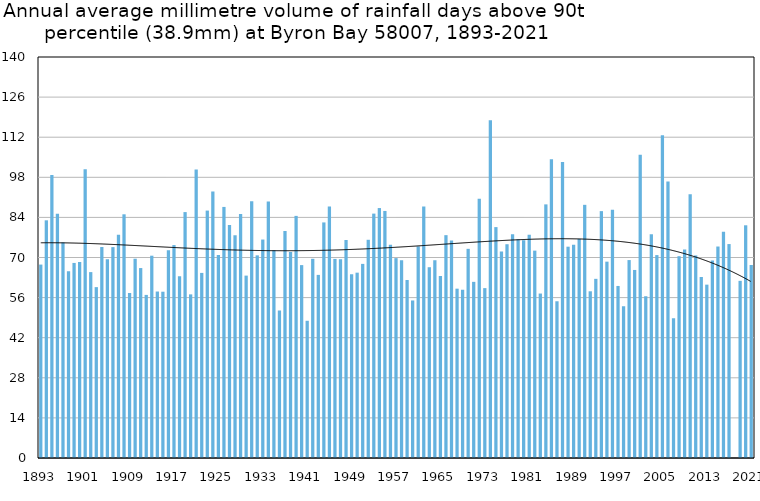
| Category | Annual average mm in days above 90th percentile |
|---|---|
| 1893 | 67.529 |
| 1894 | 82.979 |
| 1895 | 98.811 |
| 1896 | 85.3 |
| 1897 | 75.275 |
| 1898 | 65.223 |
| 1899 | 68.1 |
| 1900 | 68.4 |
| 1901 | 100.85 |
| 1902 | 64.9 |
| 1903 | 59.657 |
| 1904 | 73.658 |
| 1905 | 69.382 |
| 1906 | 73.627 |
| 1907 | 77.9 |
| 1908 | 85.082 |
| 1909 | 57.631 |
| 1910 | 69.574 |
| 1911 | 66.314 |
| 1912 | 56.942 |
| 1913 | 70.629 |
| 1914 | 58.12 |
| 1915 | 58.056 |
| 1916 | 72.567 |
| 1917 | 74.336 |
| 1918 | 63.489 |
| 1919 | 85.856 |
| 1920 | 57.125 |
| 1921 | 100.714 |
| 1922 | 64.625 |
| 1923 | 86.38 |
| 1924 | 93.05 |
| 1925 | 70.864 |
| 1926 | 87.657 |
| 1927 | 81.385 |
| 1928 | 77.767 |
| 1929 | 85.145 |
| 1930 | 63.678 |
| 1931 | 89.623 |
| 1932 | 70.75 |
| 1933 | 76.269 |
| 1934 | 89.585 |
| 1935 | 72.54 |
| 1936 | 51.511 |
| 1937 | 79.262 |
| 1938 | 71.894 |
| 1939 | 84.527 |
| 1940 | 67.344 |
| 1941 | 47.909 |
| 1942 | 69.546 |
| 1943 | 63.933 |
| 1944 | 82.246 |
| 1945 | 87.833 |
| 1946 | 69.508 |
| 1947 | 69.429 |
| 1948 | 76.109 |
| 1949 | 64.136 |
| 1950 | 64.706 |
| 1951 | 67.773 |
| 1952 | 76.189 |
| 1953 | 85.323 |
| 1954 | 87.262 |
| 1955 | 86.25 |
| 1956 | 74.485 |
| 1957 | 69.788 |
| 1958 | 69 |
| 1959 | 62.138 |
| 1960 | 55 |
| 1961 | 73.885 |
| 1962 | 87.806 |
| 1963 | 66.607 |
| 1964 | 69.045 |
| 1965 | 63.54 |
| 1966 | 77.8 |
| 1967 | 75.958 |
| 1968 | 59.117 |
| 1969 | 58.754 |
| 1970 | 73.029 |
| 1971 | 61.5 |
| 1972 | 90.489 |
| 1973 | 59.31 |
| 1974 | 117.923 |
| 1975 | 80.611 |
| 1976 | 72.105 |
| 1977 | 74.633 |
| 1978 | 78.136 |
| 1979 | 76.36 |
| 1980 | 76.036 |
| 1981 | 77.95 |
| 1982 | 72.4 |
| 1983 | 57.416 |
| 1984 | 88.547 |
| 1985 | 104.329 |
| 1986 | 54.725 |
| 1987 | 103.34 |
| 1988 | 73.779 |
| 1989 | 74.478 |
| 1990 | 76.5 |
| 1991 | 88.392 |
| 1992 | 58.2 |
| 1993 | 62.55 |
| 1994 | 86.192 |
| 1995 | 68.55 |
| 1996 | 86.655 |
| 1997 | 60.067 |
| 1998 | 53.018 |
| 1999 | 69.1 |
| 2000 | 65.65 |
| 2001 | 105.914 |
| 2002 | 56.475 |
| 2003 | 78.117 |
| 2004 | 70.84 |
| 2005 | 112.64 |
| 2006 | 96.533 |
| 2007 | 48.825 |
| 2008 | 70.457 |
| 2009 | 72.753 |
| 2010 | 92.043 |
| 2011 | 70.72 |
| 2012 | 63.2 |
| 2013 | 60.522 |
| 2014 | 68.943 |
| 2015 | 73.836 |
| 2016 | 78.982 |
| 2017 | 74.691 |
| 2018 | 0 |
| 2019 | 61.85 |
| 2020 | 81.243 |
| 2021 | 67.38 |